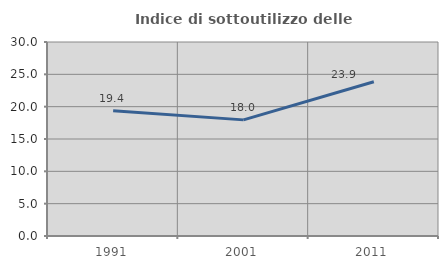
| Category | Indice di sottoutilizzo delle abitazioni  |
|---|---|
| 1991.0 | 19.357 |
| 2001.0 | 17.958 |
| 2011.0 | 23.857 |